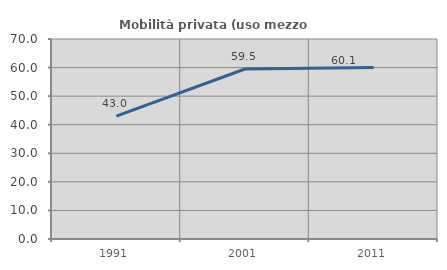
| Category | Mobilità privata (uso mezzo privato) |
|---|---|
| 1991.0 | 43.017 |
| 2001.0 | 59.492 |
| 2011.0 | 60.057 |